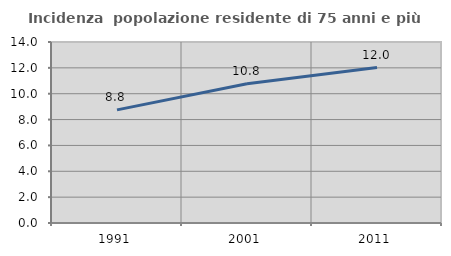
| Category | Incidenza  popolazione residente di 75 anni e più |
|---|---|
| 1991.0 | 8.75 |
| 2001.0 | 10.766 |
| 2011.0 | 12.02 |